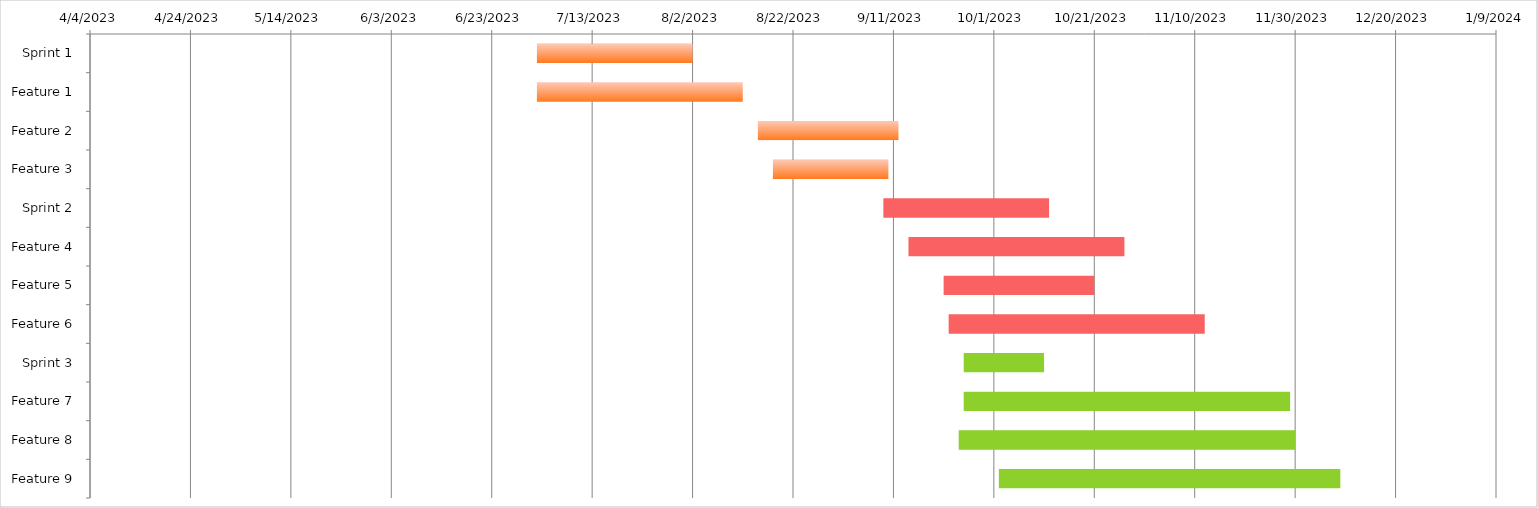
| Category | START | DURATION (DAYS) |
|---|---|---|
| Sprint 1 | 7/2/23 | 31 |
| Feature 1 | 7/2/23 | 41 |
| Feature 2 | 8/15/23 | 28 |
| Feature 3 | 8/18/23 | 23 |
| Sprint 2 | 9/9/23 | 33 |
| Feature 4 | 9/14/23 | 43 |
| Feature 5 | 9/21/23 | 30 |
| Feature 6 | 9/22/23 | 51 |
| Sprint 3 | 9/25/23 | 16 |
| Feature 7 | 9/25/23 | 65 |
| Feature 8 | 9/24/23 | 67 |
| Feature 9 | 10/2/23 | 68 |